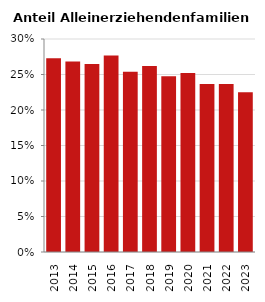
| Category | Anteil Alleinerziehende an Familien |
|---|---|
| 2013.0 | 0.273 |
| 2014.0 | 0.268 |
| 2015.0 | 0.265 |
| 2016.0 | 0.277 |
| 2017.0 | 0.254 |
| 2018.0 | 0.262 |
| 2019.0 | 0.247 |
| 2020.0 | 0.252 |
| 2021.0 | 0.237 |
| 2022.0 | 0.237 |
| 2023.0 | 0.225 |